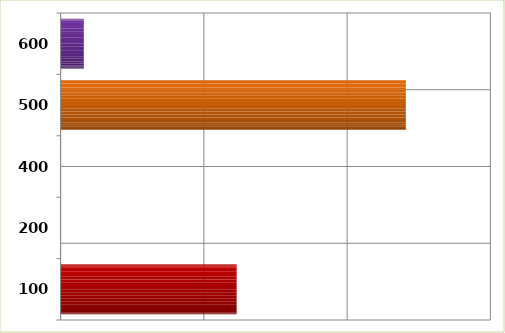
| Category | Series 0 |
|---|---|
| 100.0 | 61434787 |
| 200.0 | 0 |
| 400.0 | 0 |
| 500.0 | 120493398.562 |
| 600.0 | 8099514 |